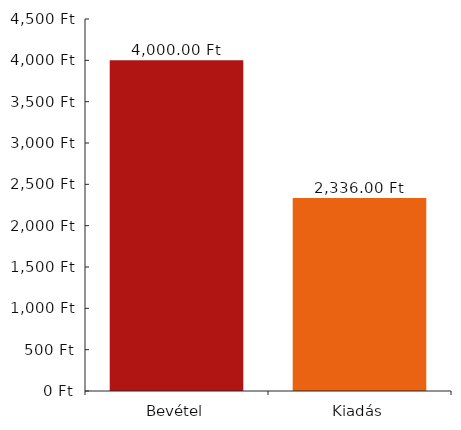
| Category | Diagramadatok |
|---|---|
| 0 | 4000 |
| 1 | 2336 |